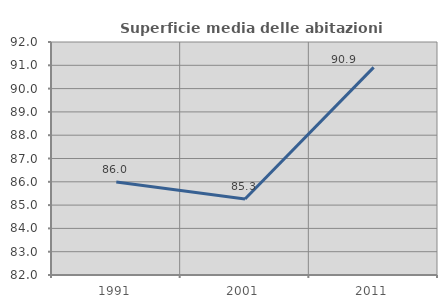
| Category | Superficie media delle abitazioni occupate |
|---|---|
| 1991.0 | 85.993 |
| 2001.0 | 85.265 |
| 2011.0 | 90.909 |